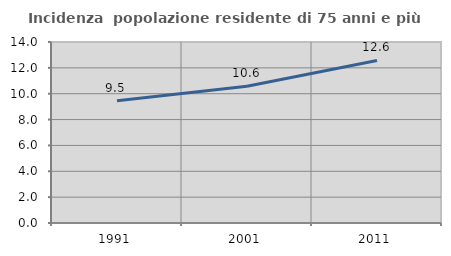
| Category | Incidenza  popolazione residente di 75 anni e più |
|---|---|
| 1991.0 | 9.458 |
| 2001.0 | 10.584 |
| 2011.0 | 12.576 |